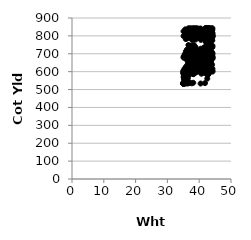
| Category | Series 0 |
|---|---|
| 35.76477211769407 | 782.667 |
| 36.35607100463797 | 623.35 |
| 40.52537472917077 | 728.379 |
| 41.47845770787869 | 810.88 |
| 42.38353659967171 | 825.893 |
| 37.74829462530018 | 702.817 |
| 35.945565586341665 | 536.127 |
| 42.97895493644228 | 663.808 |
| 42.68051495027985 | 714.856 |
| 42.992570416233704 | 700.941 |
| 41.65206110963441 | 733.245 |
| 40.023454500251454 | 629.273 |
| 43.60936035165245 | 811.573 |
| 35.239650996647896 | 545.172 |
| 39.44972008333367 | 603.564 |
| 38.70841208184434 | 682.032 |
| 35.03629085937508 | 533.957 |
| 42.58747895554772 | 691.295 |
| 41.02308473452373 | 813.47 |
| 42.19200882247771 | 719.422 |
| 37.86150242238409 | 610.586 |
| 42.18509445543468 | 769.66 |
| 38.12096757512991 | 537.824 |
| 35.04407363012764 | 593.937 |
| 38.072752979396064 | 842.11 |
| 42.44214817730562 | 647.649 |
| 41.588266828542785 | 665.271 |
| 36.51922679609246 | 632.131 |
| 37.86785582812976 | 711.279 |
| 40.825056312943815 | 678.53 |
| 38.81249017093842 | 634.463 |
| 36.38102587110056 | 694.191 |
| 43.07242720433627 | 605.076 |
| 37.696020166435055 | 840.955 |
| 35.3651073348069 | 535.888 |
| 35.36050058471108 | 535.84 |
| 40.46207621697461 | 840.76 |
| 41.77705089661551 | 668.503 |
| 41.92969125133575 | 641.007 |
| 35.10189540187573 | 605.271 |
| 38.09157739795608 | 840.128 |
| 35.00669616511791 | 533.071 |
| 41.563694706098914 | 706.709 |
| 35.074437050836465 | 591.08 |
| 42.243676367846405 | 651.277 |
| 41.84467853583401 | 594.573 |
| 36.6641241960958 | 842.699 |
| 38.461293234401765 | 782.238 |
| 43.09195481071958 | 705.905 |
| 35.804250398044736 | 536.053 |
| 39.11889638811807 | 840.463 |
| 43.509862547775064 | 665.057 |
| 36.561725927471656 | 706.363 |
| 42.78872629523064 | 654.362 |
| 36.648643536209605 | 580.296 |
| 43.658500465835886 | 793.187 |
| 42.69745790248635 | 830.342 |
| 43.58402926291476 | 711.246 |
| 36.777378325369696 | 827.04 |
| 42.07512717689739 | 691.126 |
| 39.02060555354543 | 697.1 |
| 38.604968656238285 | 705.858 |
| 43.7223153574712 | 651.149 |
| 40.323863857207726 | 651.873 |
| 41.27393230960804 | 722.164 |
| 38.55335995437084 | 835.682 |
| 43.53805073290008 | 826.921 |
| 40.09713118409404 | 711.874 |
| 38.893861019596095 | 779.95 |
| 38.94322006504363 | 682.102 |
| 39.0576944675611 | 681.441 |
| 42.487159093093595 | 629.356 |
| 37.03878573545244 | 678.389 |
| 38.70845324837626 | 616.502 |
| 41.65988964558332 | 717.194 |
| 35.07466472227249 | 595.905 |
| 38.35405096643515 | 612.387 |
| 41.8202240354939 | 535.949 |
| 42.1255668923471 | 598.893 |
| 38.22224303417263 | 585.885 |
| 42.02887828986573 | 668.033 |
| 43.622743058540166 | 834.092 |
| 42.50771419948496 | 632.601 |
| 42.07249761441459 | 659.097 |
| 42.51922034520801 | 841.152 |
| 39.046974332338095 | 693.485 |
| 37.9311260063082 | 690.046 |
| 43.315764008707255 | 616.399 |
| 37.20980575257665 | 620 |
| 43.649686332011846 | 815.838 |
| 40.54145284483533 | 777.656 |
| 41.74184851305087 | 659.765 |
| 43.95949677929364 | 693.765 |
| 38.70727445298618 | 802.811 |
| 44.13526056434008 | 735.947 |
| 43.42586312861027 | 703.352 |
| 36.613655852574134 | 748.773 |
| 43.50216440787579 | 653.18 |
| 42.61979264914397 | 664.889 |
| 38.783183216761074 | 626.079 |
| 42.46374373040054 | 725.569 |
| 41.702025967380806 | 780.559 |
| 40.04082312728198 | 613.756 |
| 37.81339972536099 | 708.13 |
| 42.67448266212136 | 805.324 |
| 37.56237747136037 | 746.042 |
| 39.29803093081942 | 823.337 |
| 35.79766315873358 | 583.313 |
| 39.64875550898212 | 653.476 |
| 42.78471714342846 | 583.516 |
| 42.99432861279579 | 829.524 |
| 35.90503910021326 | 581.576 |
| 38.16011859344847 | 696.403 |
| 42.356031869989515 | 834.65 |
| 42.59493395304475 | 816.246 |
| 40.35285014607692 | 826.053 |
| 42.01925941637523 | 684.194 |
| 43.23542933217316 | 714.086 |
| 35.687785634123145 | 595.261 |
| 39.67903093398681 | 638.883 |
| 35.112884028751054 | 678.079 |
| 42.715549361768964 | 671.239 |
| 43.98504565042386 | 708.742 |
| 38.652281642338025 | 593.946 |
| 40.756968321736835 | 815.424 |
| 35.55653638640734 | 601.855 |
| 40.558236639203415 | 791.72 |
| 35.63938882197628 | 836.696 |
| 42.41961825414334 | 584.287 |
| 38.67541570817986 | 641.885 |
| 40.44223923444817 | 533.725 |
| 42.718981538167796 | 690.736 |
| 41.73341685743937 | 688.964 |
| 38.186077023345206 | 690.004 |
| 35.41525504666126 | 533.87 |
| 42.12041433300135 | 644.044 |
| 42.510196925676944 | 692.709 |
| 38.20022286771427 | 716.717 |
| 38.423855445006794 | 697.135 |
| 38.07406914914998 | 612.574 |
| 42.99426439876295 | 587.746 |
| 42.83278842068853 | 841.365 |
| 38.218331528835016 | 623.083 |
| 35.178461259089744 | 560.009 |
| 36.13847670835961 | 576.254 |
| 37.08514577727511 | 789.574 |
| 44.15262247373322 | 842.391 |
| 39.88049412194442 | 793.622 |
| 39.49655359784663 | 685.019 |
| 39.07936482477492 | 617.637 |
| 43.250143041683536 | 776.549 |
| 38.63403258642193 | 671.831 |
| 44.15166119732241 | 704.083 |
| 38.409449289888805 | 617.286 |
| 37.507213012021744 | 589.109 |
| 43.746478995271026 | 816.28 |
| 36.565082908823285 | 578.728 |
| 42.642939358866855 | 842.251 |
| 38.42376620273516 | 656.928 |
| 40.35335893053658 | 810.935 |
| 36.34119975097573 | 676.875 |
| 38.34650363636381 | 810.376 |
| 40.84900053400039 | 598.177 |
| 42.19630036967908 | 650.673 |
| 43.30327051210684 | 707.542 |
| 41.311319619709565 | 668.102 |
| 36.71805811975245 | 673.882 |
| 39.078862312595334 | 644.115 |
| 44.13302991316354 | 605.524 |
| 37.552816125220566 | 686.921 |
| 41.25749383771223 | 629.178 |
| 37.61948502145407 | 726.659 |
| 35.04937938796481 | 538.767 |
| 36.4019746832779 | 536.354 |
| 37.668852521677344 | 593.039 |
| 40.15600047641288 | 681.305 |
| 36.6772657265185 | 821.987 |
| 42.0243225489993 | 738.753 |
| 40.217708846474814 | 839.906 |
| 41.84291294249362 | 674.492 |
| 35.38140169304594 | 535.911 |
| 38.950362857253914 | 841.779 |
| 43.82338407807687 | 632.149 |
| 43.53841695389093 | 840.484 |
| 43.17025157770377 | 711.699 |
| 42.70790875983259 | 713.647 |
| 39.04732603055501 | 723.655 |
| 35.43123335824084 | 696.92 |
| 44.143029586454304 | 807.315 |
| 41.71096365081647 | 694.642 |
| 35.092115307677616 | 570.577 |
| 41.53159839522274 | 677.108 |
| 42.87584954917538 | 767.647 |
| 35.3640485273782 | 578.836 |
| 43.98436099034793 | 779.481 |
| 43.55708835693158 | 658.277 |
| 38.58982038850541 | 627.605 |
| 41.83307118194044 | 680.44 |
| 42.976729512844415 | 712.408 |
| 42.08218620197528 | 837.195 |
| 37.984216060720435 | 588.878 |
| 35.79662135113443 | 570.738 |
| 41.67278718076626 | 830.715 |
| 42.04473635530549 | 766.644 |
| 36.808160003099786 | 603.179 |
| 38.784399719338815 | 650.446 |
| 35.07210174838625 | 825.332 |
| 41.39153288137657 | 667.372 |
| 42.94658891339607 | 842.102 |
| 39.36239734027064 | 647.047 |
| 43.53225763178204 | 661.264 |
| 40.73773531392691 | 634.092 |
| 42.44457992478404 | 842.283 |
| 42.87368522402495 | 783.264 |
| 41.568467887887984 | 736.278 |
| 37.836926409985615 | 652.914 |
| 35.75248650764957 | 800.155 |
| 36.12448810282164 | 785.158 |
| 41.735779389713734 | 643.885 |
| 40.32380705731922 | 650.713 |
| 41.700578060917096 | 604.406 |
| 41.860173496550715 | 841.766 |
| 37.82069321342802 | 613.587 |
| 35.077098599581994 | 799.366 |
| 37.52828314716994 | 615.413 |
| 42.126949763471764 | 839.741 |
| 35.269131225963 | 596.629 |
| 39.17385396460317 | 625.383 |
| 36.61162505263056 | 615.376 |
| 38.16554127016966 | 589.106 |
| 43.21410228901822 | 701.918 |
| 35.08022941252744 | 533.799 |
| 37.85895163062448 | 734.468 |
| 40.153854957264286 | 793.073 |
| 39.02420389965261 | 653.371 |
| 42.41895470142435 | 840.459 |
| 42.17043766203505 | 617.305 |
| 41.96978561299871 | 660.196 |
| 42.13565217485478 | 713.566 |
| 42.89743674088183 | 792.39 |
| 41.61458507926047 | 704.48 |
| 38.66037289076261 | 701.22 |
| 42.95293865406268 | 837.156 |
| 40.29244493224425 | 718.919 |
| 38.36019587059285 | 647.439 |
| 37.49515512190667 | 694.018 |
| 43.39831248776086 | 806.634 |
| 35.91377307478743 | 583.815 |
| 36.16370252579284 | 723.782 |
| 43.0161374211626 | 717.209 |
| 42.973672925704015 | 808.065 |
| 35.14647437523303 | 536.791 |
| 39.41972113582138 | 842.335 |
| 43.74822782596544 | 700.918 |
| 41.5917986178687 | 636.466 |
| 35.72808341460778 | 534.026 |
| 43.054160732934406 | 842.493 |
| 44.041015992947784 | 639.669 |
| 42.8817409863455 | 646.015 |
| 42.31704201741769 | 668.992 |
| 42.07121043212397 | 623.831 |
| 42.762399338036076 | 807.68 |
| 43.57712765100395 | 837.983 |
| 38.82765305819541 | 820.222 |
| 42.73612332382606 | 778.004 |
| 38.3335654972426 | 782.162 |
| 39.78469686231207 | 819.81 |
| 35.04301868977352 | 604.335 |
| 43.831667737705 | 676.504 |
| 39.44653414901568 | 826.785 |
| 44.14895104449439 | 697.395 |
| 38.03182158785792 | 824.209 |
| 43.500866230743625 | 841.659 |
| 36.159618578632475 | 680.62 |
| 43.78405030823591 | 825.895 |
| 40.03228229295046 | 707.941 |
| 37.784583541713424 | 777.683 |
| 39.223237766774005 | 823.962 |
| 42.58164741568545 | 690.593 |
| 37.5761408564092 | 621.779 |
| 37.1250833408825 | 625.073 |
| 43.76021369283192 | 708.531 |
| 42.04322735179094 | 718.035 |
| 42.52322317413949 | 673.827 |
| 42.18040445305926 | 821.832 |
| 36.586094445851366 | 625.752 |
| 39.14401056111096 | 620.041 |
| 42.21583047350856 | 841.324 |
| 36.6286305558957 | 809.889 |
| 44.18048514700527 | 801.045 |
| 41.78869764646245 | 640.014 |
| 38.230787179547846 | 631.563 |
| 42.957044897366224 | 796.88 |
| 38.55822746102151 | 688.257 |
| 35.01036378180701 | 533.216 |
| 42.69905683273353 | 786.276 |
| 42.14404388189038 | 669.238 |
| 35.452806750624745 | 535.759 |
| 42.28344286166655 | 842.076 |
| 38.60727790221415 | 695.678 |
| 43.39897374653653 | 829.931 |
| 42.21707235252151 | 821.219 |
| 36.31004883822486 | 628.203 |
| 43.6674421025853 | 691.022 |
| 38.36841586670994 | 594.256 |
| 35.20525148006695 | 578.667 |
| 38.9588089804923 | 709.481 |
| 42.59829205792272 | 676.315 |
| 41.979238822478514 | 695.04 |
| 44.18644601905836 | 673.387 |
| 35.0869060765341 | 599.186 |
| 37.706190795264966 | 595.45 |
| 42.15845432800414 | 840.06 |
| 41.852029712647564 | 725.894 |
| 37.08346906863838 | 673.378 |
| 39.72656303501132 | 668.975 |
| 36.36678654792225 | 670.65 |
| 37.40787487530854 | 602.123 |
| 43.795189302597116 | 694.486 |
| 43.698817744105675 | 674.456 |
| 38.372366792224916 | 661.721 |
| 35.96074308823921 | 668.448 |
| 43.04986387948275 | 649.109 |
| 35.35578474950146 | 539.263 |
| 35.90629967693099 | 629.493 |
| 39.17411621523702 | 706.072 |
| 36.2086124162722 | 617.976 |
| 40.6470128847656 | 617.523 |
| 39.42389460399448 | 631.513 |
| 42.11263154289075 | 707.437 |
| 42.17042133037144 | 842.977 |
| 44.18309564791651 | 675.667 |
| 44.13979067102241 | 793.405 |
| 35.42175617501793 | 558.087 |
| 35.05128632706872 | 589.316 |
| 44.11770310225631 | 688.239 |
| 41.31270323939796 | 655.998 |
| 42.243072426140735 | 700.691 |
| 44.12973208943545 | 804.883 |
| 35.966219031262106 | 612.572 |
| 38.11129155754373 | 707.019 |
| 38.106705037043746 | 698.974 |
| 36.28068798923796 | 586.761 |
| 38.32436873251413 | 617.025 |
| 43.81697497598674 | 811.104 |
| 40.04957848632562 | 601.123 |
| 37.99940456184226 | 645.107 |
| 41.75154222279532 | 630.908 |
| 44.127487191033254 | 682.986 |
| 43.36186161771308 | 711.856 |
| 38.15192929263389 | 589.273 |
| 37.97679966537182 | 680.546 |
| 44.17586037709993 | 800.114 |
| 39.54481092217379 | 655.919 |
| 35.57992071884234 | 535.648 |
| 36.326046321086224 | 546.597 |
| 42.53555132038973 | 615.886 |
| 43.16688841463491 | 717.557 |
| 35.08886705630983 | 683.586 |
| 38.97741198257301 | 646.4 |
| 43.25451929446956 | 745.851 |
| 42.8441253004793 | 808.62 |
| 42.577208641152836 | 632.267 |
| 42.54004703686617 | 560.814 |
| 39.073040876852886 | 636.124 |
| 41.66850762310248 | 662.753 |
| 35.49564291017058 | 598.446 |
| 36.84448614338529 | 701.343 |
| 44.120123598504414 | 774.219 |
| 39.14711456688006 | 597.903 |
| 43.47751671604437 | 826.981 |
| 42.3008083470818 | 839.563 |
| 37.6231015207567 | 534.928 |
| 38.01084076185477 | 632.006 |
| 35.87331270909229 | 606.193 |
| 36.562805423706706 | 676.138 |
| 38.87436038250304 | 736.891 |
| 43.28637924670326 | 768.998 |
| 36.5688405557738 | 618.858 |
| 35.81645950753028 | 713.901 |
| 42.83746515343724 | 834.892 |
| 40.42754371023365 | 784.679 |
| 35.404176872609206 | 617.613 |
| 36.16640065622981 | 602.469 |
| 44.19604544362727 | 815.857 |
| 43.95907836129217 | 823.163 |
| 42.15565372109999 | 627.733 |
| 42.99745666268052 | 841.746 |
| 38.37753925713304 | 836.681 |
| 43.214500608817936 | 841.64 |
| 42.18498274616611 | 635.706 |
| 39.46309504468205 | 803.711 |
| 39.361207873814195 | 662.267 |
| 42.540502438306035 | 825.011 |
| 39.33747606946028 | 646.682 |
| 35.54033307525443 | 588.597 |
| 39.456353255971834 | 689.139 |
| 42.05892628701664 | 673.897 |
| 36.316366921833925 | 827.585 |
| 37.054701408294996 | 537.806 |
| 38.0816886329089 | 702.647 |
| 39.67229253352336 | 791.152 |
| 42.29093234342243 | 623.325 |
| 43.48223547317019 | 754.018 |
| 39.738283026811864 | 695.423 |
| 37.32461332499779 | 620.944 |
| 36.415744897163144 | 533.72 |
| 42.09209371127391 | 692.719 |
| 42.22295585532495 | 641.02 |
| 35.552826632919434 | 810.937 |
| 37.94305733215095 | 718.324 |
| 42.73042475999639 | 694.078 |
| 39.561317816241264 | 634.145 |
| 39.15416426959534 | 715.875 |
| 42.50379941950017 | 632.402 |
| 44.1745429500768 | 616.176 |
| 35.58365862057259 | 601.15 |
| 42.37565644531318 | 623.882 |
| 42.24649414445871 | 719.522 |
| 42.2542653740911 | 808.447 |
| 38.86255156744271 | 659.963 |
| 35.25442429531567 | 595.746 |
| 38.351880142513174 | 748.85 |
| 38.22414157104162 | 610.324 |
| 39.09548934922329 | 823.669 |
| 35.040890171257445 | 534.453 |
| 42.82229825879378 | 778.189 |
| 35.54805697335161 | 575.759 |
| 41.94835268235167 | 840.267 |
| 39.630753603556045 | 646.895 |
| 38.501309584339715 | 842.793 |
| 37.338877072042536 | 597.901 |
| 42.41861831782124 | 606.42 |
| 37.619498823157976 | 662.436 |
| 38.694356489392355 | 594.024 |
| 36.44102453038323 | 617.942 |
| 43.20569365861714 | 625.696 |
| 41.891423492617555 | 613.149 |
| 35.91118698300097 | 615.856 |
| 44.1883694171515 | 600.494 |
| 37.28017739508971 | 842.753 |
| 41.01444068839794 | 683.337 |
| 43.293206101901035 | 612.746 |
| 44.16490169512624 | 682.717 |
| 35.556340134117086 | 584.026 |
| 41.242475776107284 | 593.602 |
| 44.18909030848386 | 744.621 |
| 35.003719301502834 | 533.292 |
| 42.709076439374165 | 629.919 |
| 39.801092671100385 | 652.842 |
| 41.981265240279505 | 687.813 |
| 38.15871888311218 | 711.357 |
| 36.44311142614516 | 646.826 |
| 35.402146981723625 | 602.207 |
| 42.3684302581141 | 813.496 |
| 39.97622566595677 | 716.525 |
| 42.63931170693271 | 641.878 |
| 41.68955079259014 | 790.869 |
| 42.21299530259757 | 690.828 |
| 42.59502222744842 | 657.981 |
| 43.91889054296289 | 835.542 |
| 42.43583335399215 | 759.988 |
| 40.36325371803196 | 608.069 |
| 38.33528835845476 | 691.541 |
| 35.01532287226945 | 536.061 |
| 43.00200815759928 | 841.284 |
| 44.13441684498888 | 833.786 |
| 39.78805576950193 | 697.411 |
| 43.50242519599577 | 713.759 |
| 37.271387917696636 | 625.208 |
| 38.052328641230964 | 635.256 |
| 35.01835158119382 | 534 |
| 41.93317779638883 | 841.982 |
| 43.873280265024675 | 832.964 |
| 38.085464419762864 | 682.833 |
| 39.50671105020405 | 829.575 |
| 40.679846464660415 | 588.702 |
| 43.707822945762 | 796.167 |
| 39.562130023674825 | 622.252 |
| 37.42772277156279 | 790.653 |
| 36.676424728243205 | 801.157 |
| 42.449073336337044 | 781.775 |
| 44.16433305587184 | 799.465 |
| 38.9969538027876 | 719.95 |
| 44.12531474572958 | 791.646 |
| 44.031317235791526 | 694.798 |
| 42.28013727398741 | 667.311 |
| 41.828315831320566 | 721.736 |
| 36.44732604962973 | 563.382 |
| 41.83002557061262 | 599.577 |
| 42.03249188683803 | 638.88 |
| 42.31793949885501 | 642.171 |
| 41.86339266814291 | 795.306 |
| 37.440155418117854 | 638.986 |
| 42.46026206304659 | 637.408 |
| 39.63421465828379 | 634.605 |
| 35.29951739235693 | 570.607 |
| 40.35421591968144 | 688.989 |
| 43.95398510972428 | 841.083 |
| 35.786640935379616 | 576.964 |